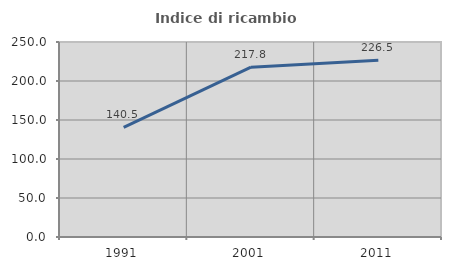
| Category | Indice di ricambio occupazionale  |
|---|---|
| 1991.0 | 140.506 |
| 2001.0 | 217.778 |
| 2011.0 | 226.549 |